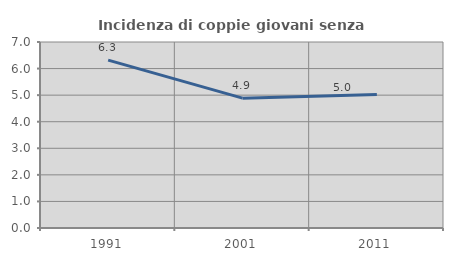
| Category | Incidenza di coppie giovani senza figli |
|---|---|
| 1991.0 | 6.318 |
| 2001.0 | 4.886 |
| 2011.0 | 5.022 |